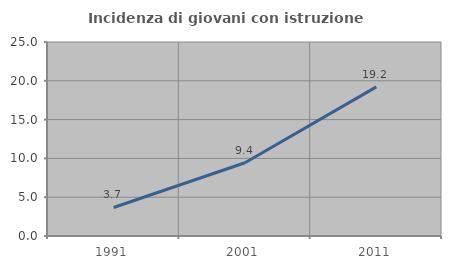
| Category | Incidenza di giovani con istruzione universitaria |
|---|---|
| 1991.0 | 3.674 |
| 2001.0 | 9.441 |
| 2011.0 | 19.212 |